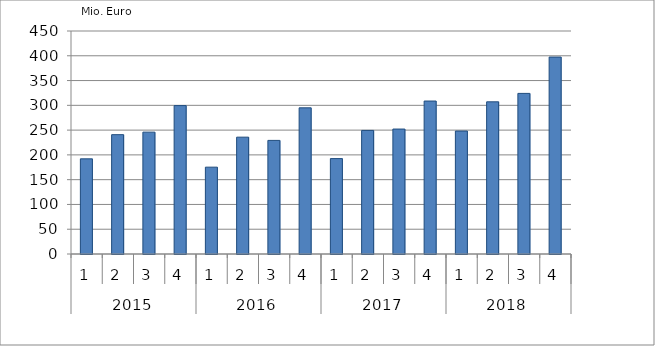
| Category | Ausbaugewerblicher Umsatz3 |
|---|---|
| 0 | 192043.756 |
| 1 | 240826.879 |
| 2 | 245916.087 |
| 3 | 299455.378 |
| 4 | 175225.59 |
| 5 | 235781.631 |
| 6 | 229227.559 |
| 7 | 294992.157 |
| 8 | 192499.539 |
| 9 | 249394.388 |
| 10 | 252146.755 |
| 11 | 308653.153 |
| 12 | 248133.418 |
| 13 | 307099.899 |
| 14 | 324088.989 |
| 15 | 397377.201 |